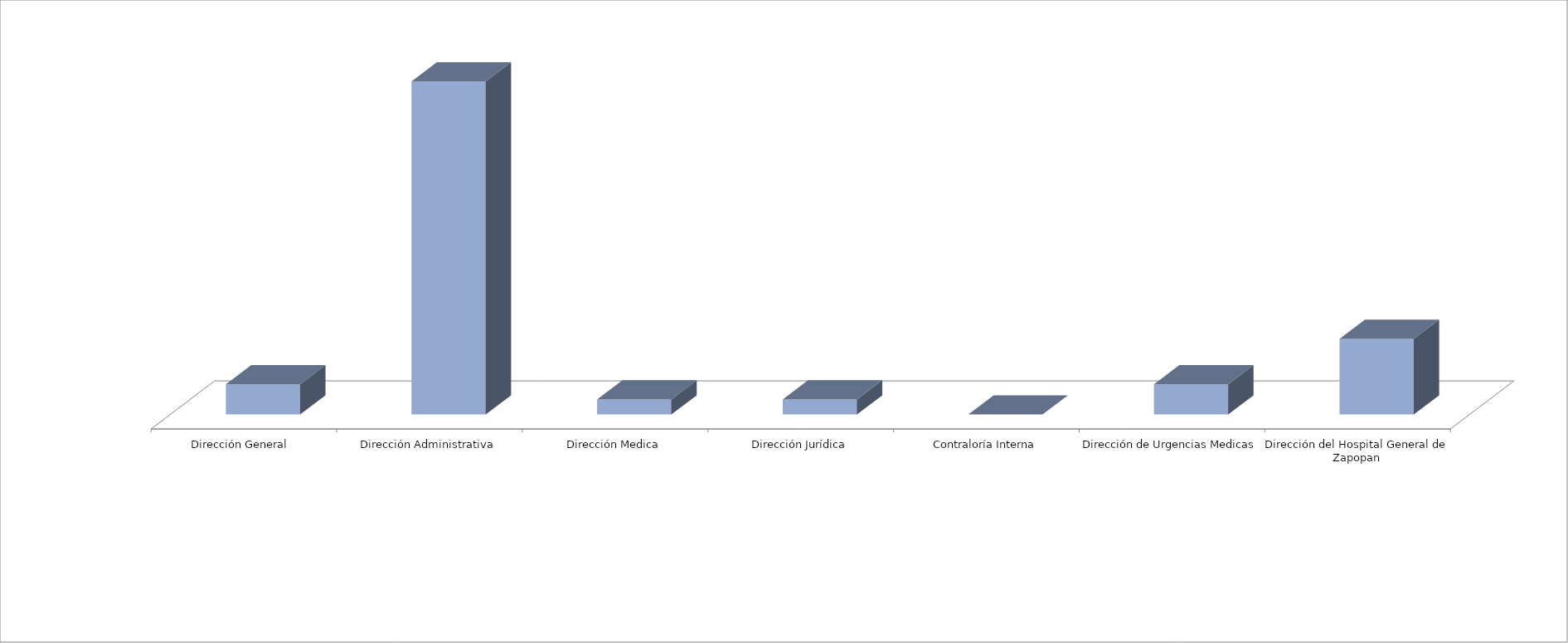
| Category | Series 0 | Series 1 |
|---|---|---|
| Dirección General  |  | 2 |
| Dirección Administrativa |  | 22 |
| Dirección Medica |  | 1 |
| Dirección Jurídica |  | 1 |
| Contraloría Interna |  | 0 |
| Dirección de Urgencias Medicas |  | 2 |
| Dirección del Hospital General de Zapopan |  | 5 |